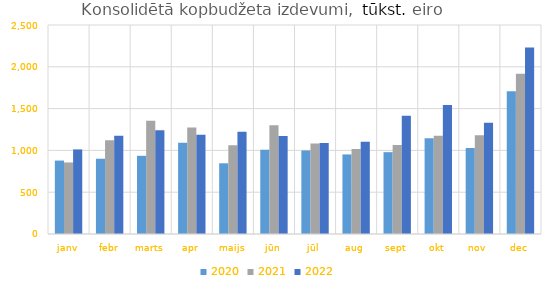
| Category | 2020 | 2021 | 2022 |
|---|---|---|---|
| janv | 878360.095 | 855571.821 | 1011780.956 |
| febr | 900276.14 | 1120070.85 | 1174583.857 |
| marts | 935266.915 | 1355758.12 | 1242068.533 |
| apr | 1090965.926 | 1273663.147 | 1187341.457 |
| maijs | 845625.072 | 1060453.286 | 1224137.323 |
| jūn | 1007637.852 | 1299852.065 | 1172050.575 |
| jūl | 999723.1 | 1081981.296 | 1088648.602 |
| aug | 951921.221 | 1017502.093 | 1104689.423 |
| sept | 978775.82 | 1064391.019 | 1413387.204 |
| okt | 1146014.897 | 1173896.626 | 1543583.073 |
| nov | 1028398.84 | 1182055.554 | 1331354.715 |
| dec | 1706433.895 | 1915376.849 | 2230910.603 |